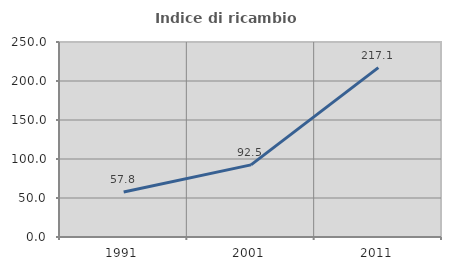
| Category | Indice di ricambio occupazionale  |
|---|---|
| 1991.0 | 57.804 |
| 2001.0 | 92.496 |
| 2011.0 | 217.134 |